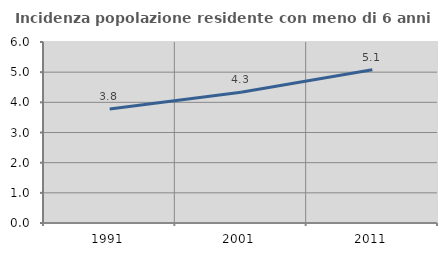
| Category | Incidenza popolazione residente con meno di 6 anni |
|---|---|
| 1991.0 | 3.778 |
| 2001.0 | 4.336 |
| 2011.0 | 5.079 |